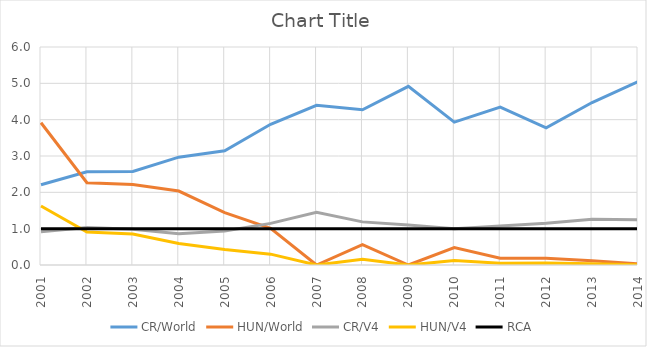
| Category | CR/World | HUN/World | CR/V4 | HUN/V4 | RCA |
|---|---|---|---|---|---|
| 2001.0 | 2.21 | 3.916 | 0.916 | 1.623 | 1 |
| 2002.0 | 2.566 | 2.265 | 1.029 | 0.908 | 1 |
| 2003.0 | 2.572 | 2.218 | 0.987 | 0.851 | 1 |
| 2004.0 | 2.967 | 2.035 | 0.86 | 0.59 | 1 |
| 2005.0 | 3.145 | 1.444 | 0.933 | 0.428 | 1 |
| 2006.0 | 3.872 | 1.011 | 1.145 | 0.299 | 1 |
| 2007.0 | 4.394 | 0 | 1.452 | 0 | 1 |
| 2008.0 | 4.271 | 0.56 | 1.187 | 0.156 | 1 |
| 2009.0 | 4.916 | 0 | 1.103 | 0 | 1 |
| 2010.0 | 3.932 | 0.478 | 0.998 | 0.121 | 1 |
| 2011.0 | 4.344 | 0.189 | 1.071 | 0.047 | 1 |
| 2012.0 | 3.774 | 0.183 | 1.15 | 0.056 | 1 |
| 2013.0 | 4.471 | 0.114 | 1.258 | 0.032 | 1 |
| 2014.0 | 5.045 | 0.031 | 1.246 | 0.008 | 1 |